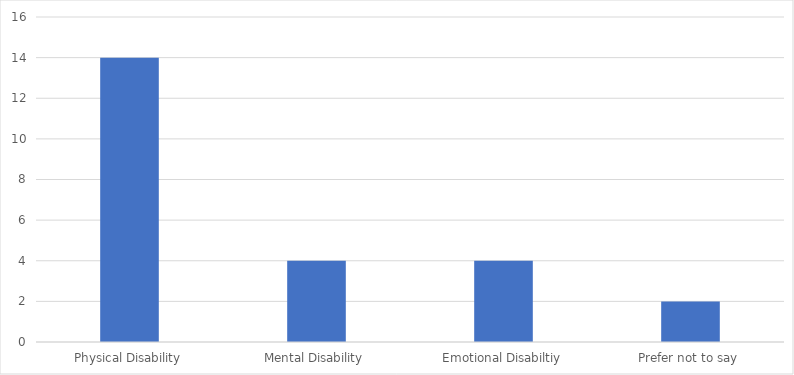
| Category | Number of Responses |
|---|---|
| Physical Disability | 14 |
| Mental Disability | 4 |
| Emotional Disabiltiy | 4 |
| Prefer not to say | 2 |